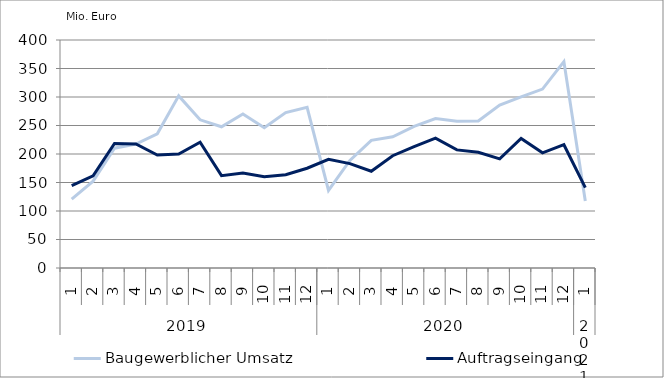
| Category | Baugewerblicher Umsatz | Auftragseingang |
|---|---|---|
| 0 | 120975.133 | 144510.881 |
| 1 | 152329.786 | 161685.201 |
| 2 | 210227.67 | 218455.879 |
| 3 | 217522.321 | 217610.064 |
| 4 | 235490.429 | 198110.439 |
| 5 | 301963.302 | 200012.086 |
| 6 | 259975.317 | 220559.061 |
| 7 | 247779.658 | 162059.723 |
| 8 | 270249.609 | 166829.611 |
| 9 | 245966.91 | 160120.773 |
| 10 | 272620.351 | 163589.389 |
| 11 | 281810.121 | 175051.247 |
| 12 | 136135.432 | 190647.086 |
| 13 | 188682.361 | 183141.14 |
| 14 | 224009.315 | 169770.009 |
| 15 | 230172.252 | 196979.845 |
| 16 | 248410.714 | 212955.83 |
| 17 | 262078.128 | 227853.487 |
| 18 | 257360.37 | 207209.188 |
| 19 | 257932.168 | 202976.091 |
| 20 | 285866.269 | 191463.844 |
| 21 | 300164.57 | 227245.467 |
| 22 | 313922.518 | 202060.636 |
| 23 | 362040.738 | 216296.504 |
| 24 | 117421.805 | 141020.655 |